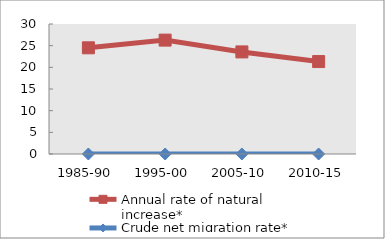
| Category | Annual rate of natural increase* | Crude net migration rate* |
|---|---|---|
| 1985-90 | 24.505 | 0 |
| 1995-00 | 26.282 | 0 |
| 2005-10 | 23.558 | 0 |
| 2010-15 | 21.335 | 0 |